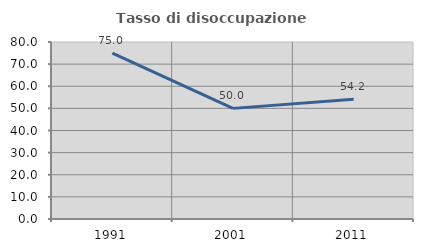
| Category | Tasso di disoccupazione giovanile  |
|---|---|
| 1991.0 | 75 |
| 2001.0 | 50 |
| 2011.0 | 54.167 |